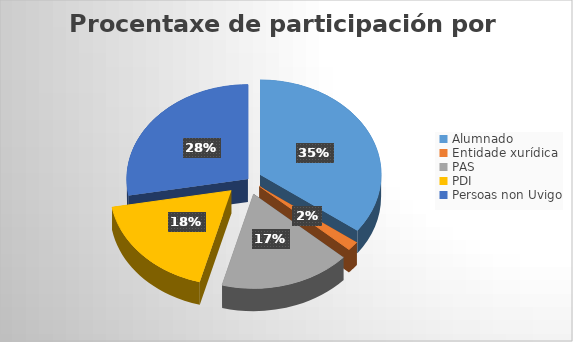
| Category | Total |
|---|---|
| Alumnado | 1077 |
| Entidade xurídica | 49 |
| PAS | 536 |
| PDI | 552 |
| Persoas non Uvigo | 853 |